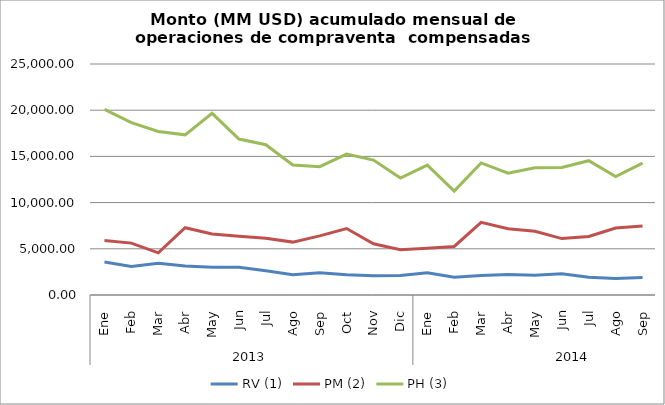
| Category | RV (1) | PM (2) | PH (3) |
|---|---|---|---|
| 0 | 3582.113 | 5901.651 | 20087.034 |
| 1 | 3086.223 | 5614.086 | 18662.914 |
| 2 | 3427.503 | 4559.027 | 17696.541 |
| 3 | 3146.302 | 7279.906 | 17332.385 |
| 4 | 2992.826 | 6596.857 | 19663.42 |
| 5 | 3012.804 | 6346.526 | 16878.408 |
| 6 | 2618.878 | 6139.885 | 16263.385 |
| 7 | 2182.732 | 5724.829 | 14069.305 |
| 8 | 2409.674 | 6399.577 | 13889.23 |
| 9 | 2180.079 | 7195.606 | 15254.774 |
| 10 | 2095.442 | 5541.836 | 14598.61 |
| 11 | 2104.88 | 4905.995 | 12657.524 |
| 12 | 2410.581 | 5047.1 | 14052.921 |
| 13 | 1913.3 | 5251.955 | 11240.27 |
| 14 | 2111.981 | 7861.413 | 14290.324 |
| 15 | 2223.473 | 7175.644 | 13176.799 |
| 16 | 2125.013 | 6892.343 | 13776.518 |
| 17 | 2301.328 | 6106.398 | 13805.87 |
| 18 | 1924.188 | 6332.088 | 14535.523 |
| 19 | 1793.449 | 7254.313 | 12809.829 |
| 20 | 1892.115 | 7460.432 | 14274.789 |